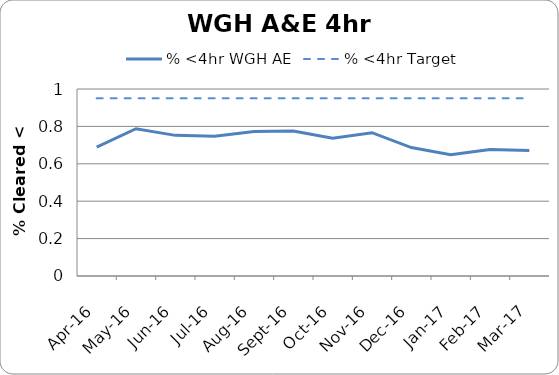
| Category | % <4hr WGH AE | % <4hr Target |
|---|---|---|
| 2016-04-01 | 0.689 |  |
| 2016-05-01 | 0.787 |  |
| 2016-06-01 | 0.752 |  |
| 2016-07-01 | 0.747 |  |
| 2016-08-01 | 0.773 |  |
| 2016-09-01 | 0.776 |  |
| 2016-10-01 | 0.736 |  |
| 2016-11-01 | 0.766 |  |
| 2016-12-01 | 0.687 |  |
| 2017-01-01 | 0.649 |  |
| 2017-02-01 | 0.676 |  |
| 2017-03-01 | 0.671 |  |